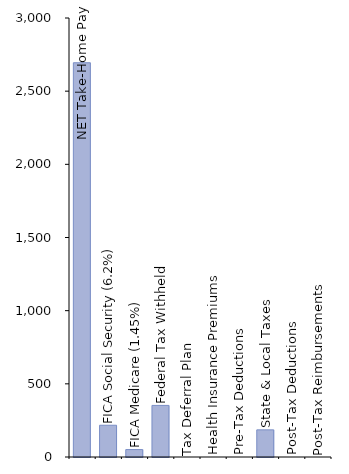
| Category | Series 0 |
|---|---|
| NET Take-Home Pay | 2694.25 |
| FICA Social Security (6.2%) | 217 |
| FICA Medicare (1.45%) | 50.75 |
| Federal Tax Withheld | 352.5 |
| Tax Deferral Plan | 0 |
| Health Insurance Premiums | 0 |
| Pre-Tax Deductions | 0 |
| State & Local Taxes | 185.5 |
| Post-Tax Deductions | 0 |
| Post-Tax Reimbursements | 0 |